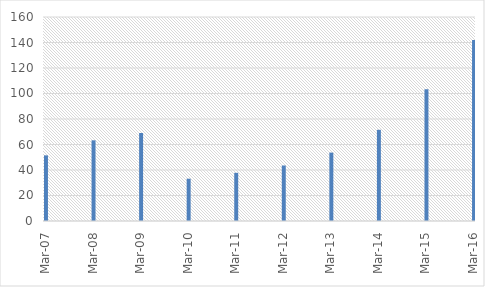
| Category | BVPS |
|---|---|
| 2007-03-31 | 51.471 |
| 2008-03-31 | 63.274 |
| 2009-03-31 | 69.028 |
| 2010-03-31 | 33.173 |
| 2011-03-31 | 37.781 |
| 2012-03-31 | 43.536 |
| 2013-03-31 | 53.648 |
| 2014-03-31 | 71.523 |
| 2015-03-31 | 103.33 |
| 2016-03-31 | 141.947 |